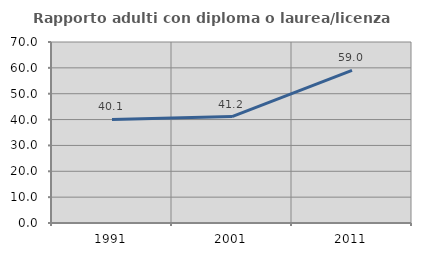
| Category | Rapporto adulti con diploma o laurea/licenza media  |
|---|---|
| 1991.0 | 40.051 |
| 2001.0 | 41.169 |
| 2011.0 | 59 |